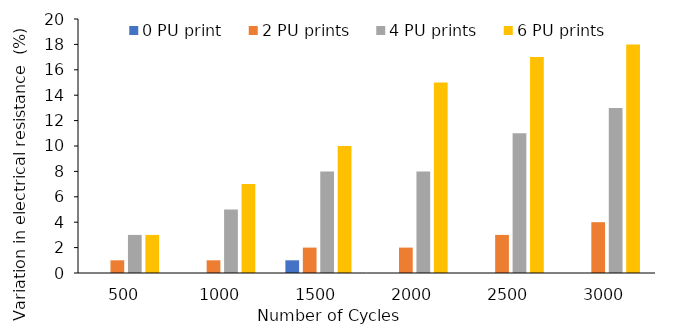
| Category | 0 PU print | 2 PU prints | 4 PU prints | 6 PU prints |
|---|---|---|---|---|
| 500.0 | 0 | 1 | 3 | 3 |
| 1000.0 | 0 | 1 | 5 | 7 |
| 1500.0 | 1 | 2 | 8 | 10 |
| 2000.0 | 0 | 2 | 8 | 15 |
| 2500.0 | 0 | 3 | 11 | 17 |
| 3000.0 | 0 | 4 | 13 | 18 |